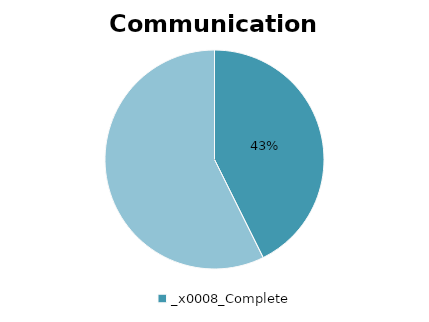
| Category | Series 0 |
|---|---|
| 0 | 32 |
| 1 | 43 |